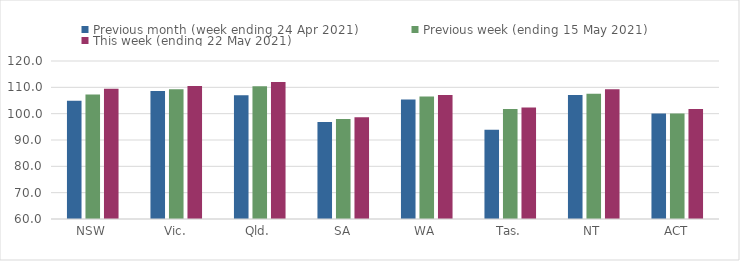
| Category | Previous month (week ending 24 Apr 2021) | Previous week (ending 15 May 2021) | This week (ending 22 May 2021) |
|---|---|---|---|
| NSW | 104.91 | 107.31 | 109.42 |
| Vic. | 108.6 | 109.25 | 110.48 |
| Qld. | 106.97 | 110.38 | 112 |
| SA | 96.8 | 97.95 | 98.66 |
| WA | 105.42 | 106.48 | 107.12 |
| Tas. | 93.87 | 101.75 | 102.3 |
| NT | 107.11 | 107.53 | 109.3 |
| ACT | 100.02 | 100.09 | 101.81 |